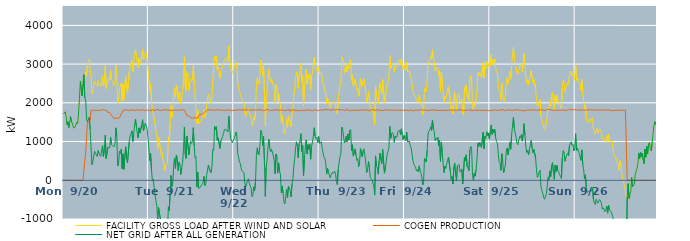
| Category | FACILITY GROSS LOAD AFTER WIND AND SOLAR | COGEN PRODUCTION | NET GRID AFTER ALL GENERATION |
|---|---|---|---|
|  Mon  9/20 | 1713 | 0 | 1713 |
|  Mon  9/20 | 1723 | 0 | 1723 |
|  Mon  9/20 | 1769 | 0 | 1769 |
|  Mon  9/20 | 1644 | 0 | 1644 |
|  Mon  9/20 | 1434 | 0 | 1434 |
|  Mon  9/20 | 1515 | 0 | 1515 |
|  Mon  9/20 | 1362 | 0 | 1362 |
|  Mon  9/20 | 1489 | 0 | 1489 |
|  Mon  9/20 | 1645 | 0 | 1645 |
|  Mon  9/20 | 1506 | 0 | 1506 |
|  Mon  9/20 | 1476 | 0 | 1476 |
|  Mon  9/20 | 1372 | 0 | 1372 |
|  Mon  9/20 | 1345 | 0 | 1345 |
|  Mon  9/20 | 1371 | 0 | 1371 |
|  Mon  9/20 | 1354 | 0 | 1354 |
|  Mon  9/20 | 1498 | 0 | 1498 |
|  Mon  9/20 | 1466 | 0 | 1466 |
|  Mon  9/20 | 1739 | 0 | 1739 |
|  Mon  9/20 | 2107 | 0 | 2107 |
|  Mon  9/20 | 2561 | 0 | 2561 |
|  Mon  9/20 | 2547 | 0 | 2547 |
|  Mon  9/20 | 2180 | 0 | 2180 |
|  Mon  9/20 | 2194 | 0 | 2194 |
|  Mon  9/20 | 2727 | 0 | 2727 |
|  Mon  9/20 | 2631 | 506 | 2125 |
|  Mon  9/20 | 2794 | 718 | 2076 |
|  Mon  9/20 | 2692 | 1110 | 1582 |
|  Mon  9/20 | 3044 | 1526 | 1518 |
|  Mon  9/20 | 3039 | 1504 | 1535 |
|  Mon  9/20 | 3120 | 1495 | 1625 |
|  Mon  9/20 | 2859 | 1535 | 1324 |
|  Mon  9/20 | 2678 | 1798 | 880 |
|  Mon  9/20 | 2235 | 1829 | 406 |
|  Mon  9/20 | 2278 | 1803 | 475 |
|  Mon  9/20 | 2450 | 1822 | 628 |
|  Mon  9/20 | 2555 | 1806 | 749 |
|  Mon  9/20 | 2552 | 1805 | 747 |
|  Mon  9/20 | 2463 | 1809 | 654 |
|  Mon  9/20 | 2426 | 1811 | 615 |
|  Mon  9/20 | 2572 | 1804 | 768 |
|  Mon  9/20 | 2503 | 1814 | 689 |
|  Mon  9/20 | 2446 | 1801 | 645 |
|  Mon  9/20 | 2418 | 1802 | 616 |
|  Mon  9/20 | 2588 | 1819 | 769 |
|  Mon  9/20 | 2691 | 1798 | 893 |
|  Mon  9/20 | 2434 | 1820 | 614 |
|  Mon  9/20 | 2596 | 1806 | 790 |
|  Mon  9/20 | 2972 | 1810 | 1162 |
|  Mon  9/20 | 2368 | 1805 | 563 |
|  Mon  9/20 | 2343 | 1792 | 551 |
|  Mon  9/20 | 2600 | 1750 | 850 |
|  Mon  9/20 | 2625 | 1764 | 861 |
|  Mon  9/20 | 2591 | 1756 | 835 |
|  Mon  9/20 | 2835 | 1716 | 1119 |
|  Mon  9/20 | 2590 | 1667 | 923 |
|  Mon  9/20 | 2558 | 1664 | 894 |
|  Mon  9/20 | 2516 | 1636 | 880 |
|  Mon  9/20 | 2455 | 1587 | 868 |
|  Mon  9/20 | 2531 | 1594 | 937 |
|  Mon  9/20 | 2960 | 1606 | 1354 |
|  Mon  9/20 | 2767 | 1614 | 1153 |
|  Mon  9/20 | 1973 | 1604 | 369 |
|  Mon  9/20 | 2049 | 1610 | 439 |
|  Mon  9/20 | 2357 | 1609 | 748 |
|  Mon  9/20 | 2357 | 1660 | 697 |
|  Mon  9/20 | 2517 | 1710 | 807 |
|  Mon  9/20 | 2046 | 1746 | 300 |
|  Mon  9/20 | 2491 | 1807 | 684 |
|  Mon  9/20 | 2089 | 1807 | 282 |
|  Mon  9/20 | 2084 | 1816 | 268 |
|  Mon  9/20 | 2672 | 1809 | 863 |
|  Mon  9/20 | 2382 | 1813 | 569 |
|  Mon  9/20 | 2262 | 1812 | 450 |
|  Mon  9/20 | 2277 | 1804 | 473 |
|  Mon  9/20 | 2797 | 1808 | 989 |
|  Mon  9/20 | 2960 | 1810 | 1150 |
|  Mon  9/20 | 3018 | 1817 | 1201 |
|  Mon  9/20 | 3098 | 1822 | 1276 |
|  Mon  9/20 | 2797 | 1795 | 1002 |
|  Mon  9/20 | 3004 | 1828 | 1176 |
|  Mon  9/20 | 3237 | 1812 | 1425 |
|  Mon  9/20 | 3368 | 1789 | 1579 |
|  Mon  9/20 | 3218 | 1826 | 1392 |
|  Mon  9/20 | 3028 | 1810 | 1218 |
|  Mon  9/20 | 2904 | 1808 | 1096 |
|  Mon  9/20 | 3165 | 1812 | 1353 |
|  Mon  9/20 | 3033 | 1814 | 1219 |
|  Mon  9/20 | 3007 | 1789 | 1218 |
|  Mon  9/20 | 3246 | 1813 | 1433 |
|  Mon  9/20 | 3380 | 1816 | 1564 |
|  Mon  9/20 | 3113 | 1825 | 1288 |
|  Mon  9/20 | 3156 | 1797 | 1359 |
|  Mon  9/20 | 3277 | 1806 | 1471 |
|  Mon  9/20 | 3305 | 1814 | 1491 |
|  Mon  9/20 | 3162 | 1813 | 1349 |
|  Mon  9/20 | 2914 | 1811 | 1103 |
|  Tue  9/21 | 2667 | 1810 | 857 |
|  Tue  9/21 | 2299 | 1793 | 506 |
|  Tue  9/21 | 2514 | 1819 | 695 |
|  Tue  9/21 | 2060 | 1787 | 273 |
|  Tue  9/21 | 1823 | 1832 | -9 |
|  Tue  9/21 | 1835 | 1810 | 25 |
|  Tue  9/21 | 1603 | 1789 | -186 |
|  Tue  9/21 | 1451 | 1815 | -364 |
|  Tue  9/21 | 1289 | 1814 | -525 |
|  Tue  9/21 | 1157 | 1822 | -665 |
|  Tue  9/21 | 818 | 1812 | -994 |
|  Tue  9/21 | 1116 | 1821 | -705 |
|  Tue  9/21 | 1104 | 1799 | -695 |
|  Tue  9/21 | 802 | 1801 | -999 |
|  Tue  9/21 | 658 | 1811 | -1153 |
|  Tue  9/21 | 708 | 1803 | -1095 |
|  Tue  9/21 | 512 | 1800 | -1288 |
|  Tue  9/21 | 461 | 1827 | -1366 |
|  Tue  9/21 | 257 | 1809 | -1552 |
|  Tue  9/21 | 405 | 1814 | -1409 |
|  Tue  9/21 | 421 | 1808 | -1387 |
|  Tue  9/21 | 448 | 1813 | -1365 |
|  Tue  9/21 | 1129 | 1813 | -684 |
|  Tue  9/21 | 1025 | 1809 | -784 |
|  Tue  9/21 | 1471 | 1809 | -338 |
|  Tue  9/21 | 1939 | 1816 | 123 |
|  Tue  9/21 | 1627 | 1788 | -161 |
|  Tue  9/21 | 1754 | 1802 | -48 |
|  Tue  9/21 | 2211 | 1822 | 389 |
|  Tue  9/21 | 2373 | 1803 | 570 |
|  Tue  9/21 | 2119 | 1811 | 308 |
|  Tue  9/21 | 2461 | 1808 | 653 |
|  Tue  9/21 | 2357 | 1803 | 554 |
|  Tue  9/21 | 2063 | 1814 | 249 |
|  Tue  9/21 | 2277 | 1816 | 461 |
|  Tue  9/21 | 2227 | 1820 | 407 |
|  Tue  9/21 | 1969 | 1817 | 152 |
|  Tue  9/21 | 2122 | 1806 | 316 |
|  Tue  9/21 | 2281 | 1816 | 465 |
|  Tue  9/21 | 2585 | 1808 | 777 |
|  Tue  9/21 | 3191 | 1816 | 1375 |
|  Tue  9/21 | 2421 | 1759 | 662 |
|  Tue  9/21 | 2316 | 1752 | 564 |
|  Tue  9/21 | 2802 | 1665 | 1137 |
|  Tue  9/21 | 2774 | 1656 | 1118 |
|  Tue  9/21 | 2323 | 1664 | 659 |
|  Tue  9/21 | 2515 | 1668 | 847 |
|  Tue  9/21 | 2625 | 1619 | 1006 |
|  Tue  9/21 | 2557 | 1604 | 953 |
|  Tue  9/21 | 2609 | 1600 | 1009 |
|  Tue  9/21 | 2965 | 1607 | 1358 |
|  Tue  9/21 | 2526 | 1618 | 908 |
|  Tue  9/21 | 2204 | 1625 | 579 |
|  Tue  9/21 | 2225 | 1616 | 609 |
|  Tue  9/21 | 1451 | 1624 | -173 |
|  Tue  9/21 | 1806 | 1599 | 207 |
|  Tue  9/21 | 1456 | 1661 | -205 |
|  Tue  9/21 | 1489 | 1704 | -215 |
|  Tue  9/21 | 1531 | 1710 | -179 |
|  Tue  9/21 | 1567 | 1704 | -137 |
|  Tue  9/21 | 1607 | 1721 | -114 |
|  Tue  9/21 | 1662 | 1719 | -57 |
|  Tue  9/21 | 1814 | 1714 | 100 |
|  Tue  9/21 | 1620 | 1759 | -139 |
|  Tue  9/21 | 1686 | 1776 | -90 |
|  Tue  9/21 | 1933 | 1806 | 127 |
|  Tue  9/21 | 1949 | 1810 | 139 |
|  Tue  9/21 | 2216 | 1821 | 395 |
|  Tue  9/21 | 2218 | 1808 | 410 |
|  Tue  9/21 | 2048 | 1817 | 231 |
|  Tue  9/21 | 1990 | 1802 | 188 |
|  Tue  9/21 | 2147 | 1804 | 343 |
|  Tue  9/21 | 2595 | 1792 | 803 |
|  Tue  9/21 | 2593 | 1817 | 776 |
|  Tue  9/21 | 3196 | 1802 | 1394 |
|  Tue  9/21 | 3111 | 1801 | 1310 |
|  Tue  9/21 | 3198 | 1813 | 1385 |
|  Tue  9/21 | 2863 | 1832 | 1031 |
|  Tue  9/21 | 2918 | 1824 | 1094 |
|  Tue  9/21 | 2923 | 1806 | 1117 |
|  Tue  9/21 | 2633 | 1809 | 824 |
|  Tue  9/21 | 2824 | 1813 | 1011 |
|  Tue  9/21 | 2873 | 1802 | 1071 |
|  Tue  9/21 | 2944 | 1809 | 1135 |
|  Tue  9/21 | 3018 | 1812 | 1206 |
|  Tue  9/21 | 3109 | 1804 | 1305 |
|  Tue  9/21 | 3143 | 1818 | 1325 |
|  Tue  9/21 | 3114 | 1804 | 1310 |
|  Tue  9/21 | 3142 | 1810 | 1332 |
|  Tue  9/21 | 3070 | 1824 | 1246 |
|  Tue  9/21 | 3472 | 1822 | 1650 |
|  Tue  9/21 | 3138 | 1810 | 1328 |
|  Tue  9/21 | 2889 | 1809 | 1080 |
|  Tue  9/21 | 2877 | 1796 | 1081 |
|  Tue  9/21 | 2780 | 1814 | 966 |
|  Tue  9/21 | 2850 | 1810 | 1040 |
|  Wed  9/22 | 2873 | 1791 | 1082 |
|  Wed  9/22 | 2957 | 1804 | 1153 |
|  Wed  9/22 | 3047 | 1804 | 1243 |
|  Wed  9/22 | 2950 | 1817 | 1133 |
|  Wed  9/22 | 2503 | 1820 | 683 |
|  Wed  9/22 | 2410 | 1819 | 591 |
|  Wed  9/22 | 2284 | 1814 | 470 |
|  Wed  9/22 | 2245 | 1818 | 427 |
|  Wed  9/22 | 2105 | 1810 | 295 |
|  Wed  9/22 | 2046 | 1810 | 236 |
|  Wed  9/22 | 2038 | 1809 | 229 |
|  Wed  9/22 | 2016 | 1818 | 198 |
|  Wed  9/22 | 1723 | 1804 | -81 |
|  Wed  9/22 | 1646 | 1817 | -171 |
|  Wed  9/22 | 1645 | 1805 | -160 |
|  Wed  9/22 | 1802 | 1815 | -13 |
|  Wed  9/22 | 1854 | 1816 | 38 |
|  Wed  9/22 | 1731 | 1810 | -79 |
|  Wed  9/22 | 1687 | 1830 | -143 |
|  Wed  9/22 | 1620 | 1810 | -190 |
|  Wed  9/22 | 1402 | 1824 | -422 |
|  Wed  9/22 | 1431 | 1817 | -386 |
|  Wed  9/22 | 1650 | 1821 | -171 |
|  Wed  9/22 | 1553 | 1818 | -265 |
|  Wed  9/22 | 1766 | 1810 | -44 |
|  Wed  9/22 | 2453 | 1811 | 642 |
|  Wed  9/22 | 2657 | 1820 | 837 |
|  Wed  9/22 | 2503 | 1819 | 684 |
|  Wed  9/22 | 2466 | 1814 | 652 |
|  Wed  9/22 | 2744 | 1822 | 922 |
|  Wed  9/22 | 3097 | 1810 | 1287 |
|  Wed  9/22 | 3031 | 1814 | 1217 |
|  Wed  9/22 | 2709 | 1811 | 898 |
|  Wed  9/22 | 2940 | 1801 | 1139 |
|  Wed  9/22 | 2300 | 1807 | 493 |
|  Wed  9/22 | 1396 | 1810 | -414 |
|  Wed  9/22 | 2140 | 1802 | 338 |
|  Wed  9/22 | 2342 | 1828 | 514 |
|  Wed  9/22 | 2672 | 1828 | 844 |
|  Wed  9/22 | 2871 | 1809 | 1062 |
|  Wed  9/22 | 2637 | 1814 | 823 |
|  Wed  9/22 | 2534 | 1805 | 729 |
|  Wed  9/22 | 2620 | 1816 | 804 |
|  Wed  9/22 | 2603 | 1802 | 801 |
|  Wed  9/22 | 2449 | 1807 | 642 |
|  Wed  9/22 | 2324 | 1817 | 507 |
|  Wed  9/22 | 1992 | 1823 | 169 |
|  Wed  9/22 | 2480 | 1804 | 676 |
|  Wed  9/22 | 2449 | 1824 | 625 |
|  Wed  9/22 | 2024 | 1839 | 185 |
|  Wed  9/22 | 2249 | 1800 | 449 |
|  Wed  9/22 | 2051 | 1810 | 241 |
|  Wed  9/22 | 1965 | 1808 | 157 |
|  Wed  9/22 | 1488 | 1812 | -324 |
|  Wed  9/22 | 1674 | 1820 | -146 |
|  Wed  9/22 | 1489 | 1815 | -326 |
|  Wed  9/22 | 1237 | 1799 | -562 |
|  Wed  9/22 | 1191 | 1803 | -612 |
|  Wed  9/22 | 1375 | 1798 | -423 |
|  Wed  9/22 | 1573 | 1812 | -239 |
|  Wed  9/22 | 1364 | 1815 | -451 |
|  Wed  9/22 | 1661 | 1819 | -158 |
|  Wed  9/22 | 1636 | 1822 | -186 |
|  Wed  9/22 | 1500 | 1782 | -282 |
|  Wed  9/22 | 1385 | 1816 | -431 |
|  Wed  9/22 | 1717 | 1818 | -101 |
|  Wed  9/22 | 1846 | 1819 | 27 |
|  Wed  9/22 | 2175 | 1824 | 351 |
|  Wed  9/22 | 2343 | 1804 | 539 |
|  Wed  9/22 | 2632 | 1807 | 825 |
|  Wed  9/22 | 2801 | 1808 | 993 |
|  Wed  9/22 | 2696 | 1809 | 887 |
|  Wed  9/22 | 2374 | 1794 | 580 |
|  Wed  9/22 | 2748 | 1805 | 943 |
|  Wed  9/22 | 2818 | 1806 | 1012 |
|  Wed  9/22 | 3010 | 1807 | 1203 |
|  Wed  9/22 | 2542 | 1795 | 747 |
|  Wed  9/22 | 2721 | 1813 | 908 |
|  Wed  9/22 | 1927 | 1807 | 120 |
|  Wed  9/22 | 2347 | 1811 | 536 |
|  Wed  9/22 | 2674 | 1808 | 866 |
|  Wed  9/22 | 2858 | 1816 | 1042 |
|  Wed  9/22 | 2493 | 1814 | 679 |
|  Wed  9/22 | 2727 | 1807 | 920 |
|  Wed  9/22 | 2616 | 1818 | 798 |
|  Wed  9/22 | 2749 | 1812 | 937 |
|  Wed  9/22 | 2350 | 1806 | 544 |
|  Wed  9/22 | 2686 | 1807 | 879 |
|  Wed  9/22 | 2765 | 1793 | 972 |
|  Wed  9/22 | 2943 | 1813 | 1130 |
|  Wed  9/22 | 3173 | 1817 | 1356 |
|  Wed  9/22 | 2942 | 1807 | 1135 |
|  Wed  9/22 | 2900 | 1825 | 1075 |
|  Wed  9/22 | 2898 | 1793 | 1105 |
|  Wed  9/22 | 2788 | 1814 | 974 |
|  Wed  9/22 | 2935 | 1804 | 1131 |
|  Thu  9/23 | 2758 | 1804 | 954 |
|  Thu  9/23 | 2760 | 1819 | 941 |
|  Thu  9/23 | 2808 | 1812 | 996 |
|  Thu  9/23 | 2630 | 1811 | 819 |
|  Thu  9/23 | 2504 | 1803 | 701 |
|  Thu  9/23 | 2404 | 1806 | 598 |
|  Thu  9/23 | 2397 | 1836 | 561 |
|  Thu  9/23 | 2251 | 1812 | 439 |
|  Thu  9/23 | 1981 | 1822 | 159 |
|  Thu  9/23 | 2112 | 1807 | 305 |
|  Thu  9/23 | 2036 | 1828 | 208 |
|  Thu  9/23 | 2019 | 1807 | 212 |
|  Thu  9/23 | 1868 | 1806 | 62 |
|  Thu  9/23 | 1937 | 1800 | 137 |
|  Thu  9/23 | 2017 | 1823 | 194 |
|  Thu  9/23 | 2020 | 1817 | 203 |
|  Thu  9/23 | 2005 | 1820 | 185 |
|  Thu  9/23 | 2037 | 1805 | 232 |
|  Thu  9/23 | 1982 | 1811 | 171 |
|  Thu  9/23 | 1771 | 1807 | -36 |
|  Thu  9/23 | 1720 | 1830 | -110 |
|  Thu  9/23 | 2086 | 1812 | 274 |
|  Thu  9/23 | 2282 | 1822 | 460 |
|  Thu  9/23 | 2417 | 1812 | 605 |
|  Thu  9/23 | 2497 | 1807 | 690 |
|  Thu  9/23 | 3184 | 1811 | 1373 |
|  Thu  9/23 | 3133 | 1823 | 1310 |
|  Thu  9/23 | 3103 | 1805 | 1298 |
|  Thu  9/23 | 2767 | 1803 | 964 |
|  Thu  9/23 | 2830 | 1806 | 1024 |
|  Thu  9/23 | 2951 | 1813 | 1138 |
|  Thu  9/23 | 2796 | 1808 | 988 |
|  Thu  9/23 | 3023 | 1825 | 1198 |
|  Thu  9/23 | 2879 | 1839 | 1040 |
|  Thu  9/23 | 3075 | 1791 | 1284 |
|  Thu  9/23 | 3118 | 1807 | 1311 |
|  Thu  9/23 | 2566 | 1805 | 761 |
|  Thu  9/23 | 2723 | 1804 | 919 |
|  Thu  9/23 | 2431 | 1806 | 625 |
|  Thu  9/23 | 2514 | 1819 | 695 |
|  Thu  9/23 | 2614 | 1805 | 809 |
|  Thu  9/23 | 2470 | 1814 | 656 |
|  Thu  9/23 | 2324 | 1810 | 514 |
|  Thu  9/23 | 2364 | 1807 | 557 |
|  Thu  9/23 | 2165 | 1812 | 353 |
|  Thu  9/23 | 2268 | 1809 | 459 |
|  Thu  9/23 | 2626 | 1806 | 820 |
|  Thu  9/23 | 2650 | 1811 | 839 |
|  Thu  9/23 | 2428 | 1825 | 603 |
|  Thu  9/23 | 2568 | 1808 | 760 |
|  Thu  9/23 | 2621 | 1809 | 812 |
|  Thu  9/23 | 2463 | 1817 | 646 |
|  Thu  9/23 | 2271 | 1816 | 455 |
|  Thu  9/23 | 2011 | 1810 | 201 |
|  Thu  9/23 | 2060 | 1808 | 252 |
|  Thu  9/23 | 2298 | 1812 | 486 |
|  Thu  9/23 | 2131 | 1795 | 336 |
|  Thu  9/23 | 1880 | 1811 | 69 |
|  Thu  9/23 | 1900 | 1817 | 83 |
|  Thu  9/23 | 1846 | 1822 | 24 |
|  Thu  9/23 | 1746 | 1824 | -78 |
|  Thu  9/23 | 1685 | 1809 | -124 |
|  Thu  9/23 | 1429 | 1812 | -383 |
|  Thu  9/23 | 2439 | 1809 | 630 |
|  Thu  9/23 | 2177 | 1814 | 363 |
|  Thu  9/23 | 2137 | 1818 | 319 |
|  Thu  9/23 | 1977 | 1819 | 158 |
|  Thu  9/23 | 2303 | 1806 | 497 |
|  Thu  9/23 | 2513 | 1809 | 704 |
|  Thu  9/23 | 2327 | 1813 | 514 |
|  Thu  9/23 | 2226 | 1800 | 426 |
|  Thu  9/23 | 2601 | 1807 | 794 |
|  Thu  9/23 | 2584 | 1807 | 777 |
|  Thu  9/23 | 1996 | 1812 | 184 |
|  Thu  9/23 | 2126 | 1817 | 309 |
|  Thu  9/23 | 2135 | 1805 | 330 |
|  Thu  9/23 | 2485 | 1818 | 667 |
|  Thu  9/23 | 2541 | 1794 | 747 |
|  Thu  9/23 | 2644 | 1815 | 829 |
|  Thu  9/23 | 3223 | 1832 | 1391 |
|  Thu  9/23 | 2891 | 1809 | 1082 |
|  Thu  9/23 | 3018 | 1814 | 1204 |
|  Thu  9/23 | 3040 | 1808 | 1232 |
|  Thu  9/23 | 2999 | 1807 | 1192 |
|  Thu  9/23 | 2800 | 1820 | 980 |
|  Thu  9/23 | 2937 | 1796 | 1141 |
|  Thu  9/23 | 2929 | 1797 | 1132 |
|  Thu  9/23 | 2925 | 1813 | 1112 |
|  Thu  9/23 | 3075 | 1821 | 1254 |
|  Thu  9/23 | 3076 | 1806 | 1270 |
|  Thu  9/23 | 3095 | 1801 | 1294 |
|  Thu  9/23 | 2992 | 1818 | 1174 |
|  Thu  9/23 | 3141 | 1813 | 1328 |
|  Thu  9/23 | 2981 | 1807 | 1174 |
|  Thu  9/23 | 2859 | 1811 | 1048 |
|  Thu  9/23 | 2960 | 1805 | 1155 |
|  Fri  9/24 | 2880 | 1798 | 1082 |
|  Fri  9/24 | 2840 | 1811 | 1029 |
|  Fri  9/24 | 3054 | 1811 | 1243 |
|  Fri  9/24 | 2795 | 1807 | 988 |
|  Fri  9/24 | 2808 | 1800 | 1008 |
|  Fri  9/24 | 2828 | 1813 | 1015 |
|  Fri  9/24 | 2694 | 1807 | 887 |
|  Fri  9/24 | 2637 | 1803 | 834 |
|  Fri  9/24 | 2483 | 1807 | 676 |
|  Fri  9/24 | 2324 | 1816 | 508 |
|  Fri  9/24 | 2209 | 1782 | 427 |
|  Fri  9/24 | 2187 | 1814 | 373 |
|  Fri  9/24 | 2153 | 1810 | 343 |
|  Fri  9/24 | 2050 | 1809 | 241 |
|  Fri  9/24 | 2062 | 1792 | 270 |
|  Fri  9/24 | 2016 | 1803 | 213 |
|  Fri  9/24 | 2200 | 1827 | 373 |
|  Fri  9/24 | 2079 | 1821 | 258 |
|  Fri  9/24 | 1987 | 1806 | 181 |
|  Fri  9/24 | 1908 | 1822 | 86 |
|  Fri  9/24 | 1693 | 1810 | -117 |
|  Fri  9/24 | 1750 | 1807 | -57 |
|  Fri  9/24 | 2373 | 1805 | 568 |
|  Fri  9/24 | 2332 | 1810 | 522 |
|  Fri  9/24 | 2285 | 1815 | 470 |
|  Fri  9/24 | 2579 | 1809 | 770 |
|  Fri  9/24 | 3002 | 1811 | 1191 |
|  Fri  9/24 | 3066 | 1798 | 1268 |
|  Fri  9/24 | 3121 | 1809 | 1312 |
|  Fri  9/24 | 3198 | 1817 | 1381 |
|  Fri  9/24 | 3113 | 1826 | 1287 |
|  Fri  9/24 | 3371 | 1815 | 1556 |
|  Fri  9/24 | 3142 | 1815 | 1327 |
|  Fri  9/24 | 3075 | 1820 | 1255 |
|  Fri  9/24 | 2828 | 1802 | 1026 |
|  Fri  9/24 | 2889 | 1803 | 1086 |
|  Fri  9/24 | 2864 | 1811 | 1053 |
|  Fri  9/24 | 2910 | 1801 | 1109 |
|  Fri  9/24 | 2699 | 1812 | 887 |
|  Fri  9/24 | 2832 | 1805 | 1027 |
|  Fri  9/24 | 2291 | 1805 | 486 |
|  Fri  9/24 | 2796 | 1806 | 990 |
|  Fri  9/24 | 2528 | 1808 | 720 |
|  Fri  9/24 | 2241 | 1810 | 431 |
|  Fri  9/24 | 2005 | 1807 | 198 |
|  Fri  9/24 | 2166 | 1800 | 366 |
|  Fri  9/24 | 2110 | 1803 | 307 |
|  Fri  9/24 | 2231 | 1804 | 427 |
|  Fri  9/24 | 2215 | 1801 | 414 |
|  Fri  9/24 | 2412 | 1814 | 598 |
|  Fri  9/24 | 2392 | 1810 | 582 |
|  Fri  9/24 | 2054 | 1808 | 246 |
|  Fri  9/24 | 1835 | 1814 | 21 |
|  Fri  9/24 | 1914 | 1816 | 98 |
|  Fri  9/24 | 1713 | 1806 | -93 |
|  Fri  9/24 | 2150 | 1813 | 337 |
|  Fri  9/24 | 2264 | 1819 | 445 |
|  Fri  9/24 | 1953 | 1810 | 143 |
|  Fri  9/24 | 1800 | 1809 | -9 |
|  Fri  9/24 | 2186 | 1814 | 372 |
|  Fri  9/24 | 2180 | 1806 | 374 |
|  Fri  9/24 | 2227 | 1818 | 409 |
|  Fri  9/24 | 2025 | 1808 | 217 |
|  Fri  9/24 | 2059 | 1816 | 243 |
|  Fri  9/24 | 2092 | 1803 | 289 |
|  Fri  9/24 | 1724 | 1817 | -93 |
|  Fri  9/24 | 1679 | 1790 | -111 |
|  Fri  9/24 | 2393 | 1809 | 584 |
|  Fri  9/24 | 2308 | 1811 | 497 |
|  Fri  9/24 | 2472 | 1815 | 657 |
|  Fri  9/24 | 2158 | 1806 | 352 |
|  Fri  9/24 | 2104 | 1793 | 311 |
|  Fri  9/24 | 2058 | 1812 | 246 |
|  Fri  9/24 | 2594 | 1805 | 789 |
|  Fri  9/24 | 2700 | 1827 | 873 |
|  Fri  9/24 | 2621 | 1787 | 834 |
|  Fri  9/24 | 1939 | 1796 | 143 |
|  Fri  9/24 | 1810 | 1811 | -1 |
|  Fri  9/24 | 1987 | 1806 | 181 |
|  Fri  9/24 | 1923 | 1815 | 108 |
|  Fri  9/24 | 2093 | 1823 | 270 |
|  Fri  9/24 | 2313 | 1790 | 523 |
|  Fri  9/24 | 2775 | 1816 | 959 |
|  Fri  9/24 | 2692 | 1822 | 870 |
|  Fri  9/24 | 2791 | 1808 | 983 |
|  Fri  9/24 | 2731 | 1817 | 914 |
|  Fri  9/24 | 2643 | 1800 | 843 |
|  Fri  9/24 | 2632 | 1814 | 818 |
|  Fri  9/24 | 3043 | 1807 | 1236 |
|  Fri  9/24 | 2639 | 1821 | 818 |
|  Fri  9/24 | 2942 | 1808 | 1134 |
|  Fri  9/24 | 2884 | 1798 | 1086 |
|  Fri  9/24 | 3065 | 1811 | 1254 |
|  Fri  9/24 | 2971 | 1820 | 1151 |
|  Fri  9/24 | 3012 | 1794 | 1218 |
|  Fri  9/24 | 2868 | 1809 | 1059 |
|  Sat  9/25 | 3065 | 1807 | 1258 |
|  Sat  9/25 | 3241 | 1814 | 1427 |
|  Sat  9/25 | 2987 | 1800 | 1187 |
|  Sat  9/25 | 3120 | 1809 | 1311 |
|  Sat  9/25 | 3049 | 1817 | 1232 |
|  Sat  9/25 | 3134 | 1818 | 1316 |
|  Sat  9/25 | 2919 | 1815 | 1104 |
|  Sat  9/25 | 2811 | 1810 | 1001 |
|  Sat  9/25 | 2756 | 1800 | 956 |
|  Sat  9/25 | 2501 | 1814 | 687 |
|  Sat  9/25 | 2293 | 1814 | 479 |
|  Sat  9/25 | 2255 | 1816 | 439 |
|  Sat  9/25 | 2064 | 1810 | 254 |
|  Sat  9/25 | 2503 | 1820 | 683 |
|  Sat  9/25 | 2299 | 1824 | 475 |
|  Sat  9/25 | 2010 | 1815 | 195 |
|  Sat  9/25 | 2090 | 1803 | 287 |
|  Sat  9/25 | 2219 | 1825 | 394 |
|  Sat  9/25 | 2558 | 1801 | 757 |
|  Sat  9/25 | 2646 | 1813 | 833 |
|  Sat  9/25 | 2482 | 1824 | 658 |
|  Sat  9/25 | 2613 | 1812 | 801 |
|  Sat  9/25 | 2802 | 1814 | 988 |
|  Sat  9/25 | 2613 | 1810 | 803 |
|  Sat  9/25 | 2967 | 1804 | 1163 |
|  Sat  9/25 | 2976 | 1812 | 1164 |
|  Sat  9/25 | 3437 | 1806 | 1631 |
|  Sat  9/25 | 3152 | 1806 | 1346 |
|  Sat  9/25 | 3153 | 1814 | 1339 |
|  Sat  9/25 | 2924 | 1810 | 1114 |
|  Sat  9/25 | 2775 | 1822 | 953 |
|  Sat  9/25 | 2722 | 1805 | 917 |
|  Sat  9/25 | 2841 | 1810 | 1031 |
|  Sat  9/25 | 2933 | 1803 | 1130 |
|  Sat  9/25 | 2910 | 1809 | 1101 |
|  Sat  9/25 | 2995 | 1810 | 1185 |
|  Sat  9/25 | 2802 | 1791 | 1011 |
|  Sat  9/25 | 2974 | 1804 | 1170 |
|  Sat  9/25 | 3272 | 1809 | 1463 |
|  Sat  9/25 | 2976 | 1817 | 1159 |
|  Sat  9/25 | 2666 | 1787 | 879 |
|  Sat  9/25 | 2505 | 1789 | 716 |
|  Sat  9/25 | 2597 | 1827 | 770 |
|  Sat  9/25 | 2474 | 1821 | 653 |
|  Sat  9/25 | 2598 | 1815 | 783 |
|  Sat  9/25 | 2604 | 1803 | 801 |
|  Sat  9/25 | 2844 | 1816 | 1028 |
|  Sat  9/25 | 2642 | 1808 | 834 |
|  Sat  9/25 | 2517 | 1806 | 711 |
|  Sat  9/25 | 2608 | 1813 | 795 |
|  Sat  9/25 | 2611 | 1821 | 790 |
|  Sat  9/25 | 2389 | 1812 | 577 |
|  Sat  9/25 | 2062 | 1805 | 257 |
|  Sat  9/25 | 1898 | 1821 | 77 |
|  Sat  9/25 | 1932 | 1807 | 125 |
|  Sat  9/25 | 2019 | 1796 | 223 |
|  Sat  9/25 | 2084 | 1821 | 263 |
|  Sat  9/25 | 1658 | 1818 | -160 |
|  Sat  9/25 | 1562 | 1817 | -255 |
|  Sat  9/25 | 1472 | 1808 | -336 |
|  Sat  9/25 | 1378 | 1814 | -436 |
|  Sat  9/25 | 1322 | 1812 | -490 |
|  Sat  9/25 | 1325 | 1803 | -478 |
|  Sat  9/25 | 1450 | 1814 | -364 |
|  Sat  9/25 | 1656 | 1831 | -175 |
|  Sat  9/25 | 1885 | 1809 | 76 |
|  Sat  9/25 | 1848 | 1830 | 18 |
|  Sat  9/25 | 2048 | 1807 | 241 |
|  Sat  9/25 | 1914 | 1819 | 95 |
|  Sat  9/25 | 2197 | 1812 | 385 |
|  Sat  9/25 | 2266 | 1812 | 454 |
|  Sat  9/25 | 2029 | 1810 | 219 |
|  Sat  9/25 | 1829 | 1804 | 25 |
|  Sat  9/25 | 2195 | 1802 | 393 |
|  Sat  9/25 | 2032 | 1812 | 220 |
|  Sat  9/25 | 2185 | 1802 | 383 |
|  Sat  9/25 | 2058 | 1806 | 252 |
|  Sat  9/25 | 2028 | 1809 | 219 |
|  Sat  9/25 | 1950 | 1806 | 144 |
|  Sat  9/25 | 1912 | 1809 | 103 |
|  Sat  9/25 | 1857 | 1810 | 47 |
|  Sat  9/25 | 2388 | 1809 | 579 |
|  Sat  9/25 | 2582 | 1818 | 764 |
|  Sat  9/25 | 2518 | 1810 | 708 |
|  Sat  9/25 | 2297 | 1804 | 493 |
|  Sat  9/25 | 2401 | 1801 | 600 |
|  Sat  9/25 | 2403 | 1796 | 607 |
|  Sat  9/25 | 2517 | 1815 | 702 |
|  Sat  9/25 | 2471 | 1840 | 631 |
|  Sat  9/25 | 2699 | 1813 | 886 |
|  Sat  9/25 | 2770 | 1807 | 963 |
|  Sat  9/25 | 2818 | 1823 | 995 |
|  Sat  9/25 | 2697 | 1801 | 896 |
|  Sat  9/25 | 2745 | 1817 | 928 |
|  Sat  9/25 | 2582 | 1822 | 760 |
|  Sat  9/25 | 2644 | 1824 | 820 |
|  Sun  9/26 | 3020 | 1819 | 1201 |
|  Sun  9/26 | 2581 | 1812 | 769 |
|  Sun  9/26 | 2639 | 1805 | 834 |
|  Sun  9/26 | 2576 | 1814 | 762 |
|  Sun  9/26 | 2523 | 1829 | 694 |
|  Sun  9/26 | 2496 | 1811 | 685 |
|  Sun  9/26 | 2324 | 1811 | 513 |
|  Sun  9/26 | 2600 | 1816 | 784 |
|  Sun  9/26 | 2230 | 1813 | 417 |
|  Sun  9/26 | 2099 | 1816 | 283 |
|  Sun  9/26 | 1849 | 1812 | 37 |
|  Sun  9/26 | 1945 | 1804 | 141 |
|  Sun  9/26 | 1631 | 1817 | -186 |
|  Sun  9/26 | 1518 | 1833 | -315 |
|  Sun  9/26 | 1485 | 1807 | -322 |
|  Sun  9/26 | 1552 | 1821 | -269 |
|  Sun  9/26 | 1581 | 1826 | -245 |
|  Sun  9/26 | 1520 | 1817 | -297 |
|  Sun  9/26 | 1536 | 1811 | -275 |
|  Sun  9/26 | 1613 | 1805 | -192 |
|  Sun  9/26 | 1322 | 1810 | -488 |
|  Sun  9/26 | 1238 | 1815 | -577 |
|  Sun  9/26 | 1188 | 1814 | -626 |
|  Sun  9/26 | 1306 | 1797 | -491 |
|  Sun  9/26 | 1346 | 1815 | -469 |
|  Sun  9/26 | 1212 | 1803 | -591 |
|  Sun  9/26 | 1208 | 1812 | -604 |
|  Sun  9/26 | 1325 | 1821 | -496 |
|  Sun  9/26 | 1288 | 1819 | -531 |
|  Sun  9/26 | 1218 | 1810 | -592 |
|  Sun  9/26 | 1063 | 1809 | -746 |
|  Sun  9/26 | 1094 | 1803 | -709 |
|  Sun  9/26 | 1061 | 1811 | -750 |
|  Sun  9/26 | 997 | 1807 | -810 |
|  Sun  9/26 | 1043 | 1818 | -775 |
|  Sun  9/26 | 1154 | 1819 | -665 |
|  Sun  9/26 | 964 | 1813 | -849 |
|  Sun  9/26 | 1183 | 1829 | -646 |
|  Sun  9/26 | 1055 | 1817 | -762 |
|  Sun  9/26 | 1058 | 1814 | -756 |
|  Sun  9/26 | 987 | 1803 | -816 |
|  Sun  9/26 | 1015 | 1808 | -793 |
|  Sun  9/26 | 837 | 1798 | -961 |
|  Sun  9/26 | 679 | 1815 | -1136 |
|  Sun  9/26 | 609 | 1803 | -1194 |
|  Sun  9/26 | 574 | 1808 | -1234 |
|  Sun  9/26 | 574 | 1807 | -1233 |
|  Sun  9/26 | 475 | 1816 | -1341 |
|  Sun  9/26 | 451 | 1805 | -1354 |
|  Sun  9/26 | 258 | 1796 | -1538 |
|  Sun  9/26 | 507 | 1810 | -1303 |
|  Sun  9/26 | 380 | 1806 | -1426 |
|  Sun  9/26 | 152 | 1805 | -1653 |
|  Sun  9/26 | 50 | 1820 | -1770 |
|  Sun  9/26 | -53 | 1813 | -1866 |
|  Sun  9/26 | -191 | 1812 | -2003 |
|  Sun  9/26 | -263 | 1815 | -2078 |
|  Sun  9/26 | -485 | 1818 | -2303 |
|  Sun  9/26 | -429 | 0 | -429 |
|  Sun  9/26 | -85 | 0 | -85 |
|  Sun  9/26 | -469 | 0 | -469 |
|  Sun  9/26 | -366 | 0 | -366 |
|  Sun  9/26 | -287 | 0 | -287 |
|  Sun  9/26 | 71 | 0 | 71 |
|  Sun  9/26 | -167 | 0 | -167 |
|  Sun  9/26 | -147 | 0 | -147 |
|  Sun  9/26 | -111 | 0 | -111 |
|  Sun  9/26 | 151 | 0 | 151 |
|  Sun  9/26 | 237 | 0 | 237 |
|  Sun  9/26 | 302 | 0 | 302 |
|  Sun  9/26 | 436 | 0 | 436 |
|  Sun  9/26 | 706 | 0 | 706 |
|  Sun  9/26 | 559 | 0 | 559 |
|  Sun  9/26 | 730 | 0 | 730 |
|  Sun  9/26 | 600 | 0 | 600 |
|  Sun  9/26 | 700 | 0 | 700 |
|  Sun  9/26 | 514 | 0 | 514 |
|  Sun  9/26 | 422 | 0 | 422 |
|  Sun  9/26 | 807 | 0 | 807 |
|  Sun  9/26 | 593 | 0 | 593 |
|  Sun  9/26 | 877 | 0 | 877 |
|  Sun  9/26 | 683 | 0 | 683 |
|  Sun  9/26 | 933 | 0 | 933 |
|  Sun  9/26 | 983 | 0 | 983 |
|  Sun  9/26 | 818 | 0 | 818 |
|  Sun  9/26 | 758 | 0 | 758 |
|  Sun  9/26 | 959 | 0 | 959 |
|  Sun  9/26 | 1188 | 0 | 1188 |
|  Sun  9/26 | 1386 | 0 | 1386 |
|  Sun  9/26 | 1513 | 0 | 1513 |
|  Sun  9/26 | 1448 | 0 | 1448 |
|  Sun  9/26 | 1415 | 0 | 1415 |